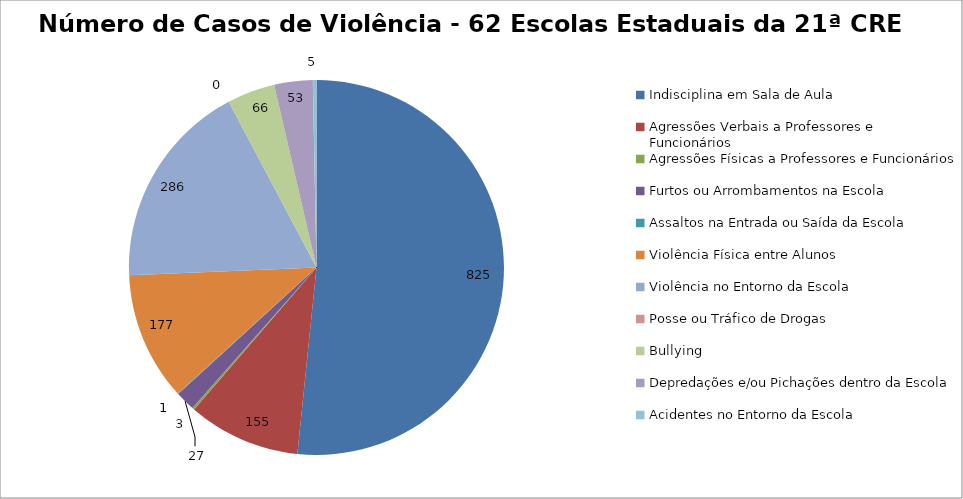
| Category | Número de Casos |
|---|---|
| Indisciplina em Sala de Aula | 825 |
| Agressões Verbais a Professores e Funcionários | 155 |
| Agressões Físicas a Professores e Funcionários | 3 |
| Furtos ou Arrombamentos na Escola | 27 |
| Assaltos na Entrada ou Saída da Escola | 1 |
| Violência Física entre Alunos | 177 |
| Violência no Entorno da Escola | 286 |
| Posse ou Tráfico de Drogas | 0 |
| Bullying | 66 |
| Depredações e/ou Pichações dentro da Escola | 53 |
| Acidentes no Entorno da Escola | 5 |